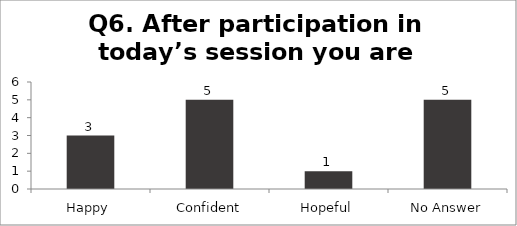
| Category | Q6. After participation in today’s session you are feeling? |
|---|---|
| Happy | 3 |
| Confident | 5 |
| Hopeful | 1 |
| No Answer | 5 |